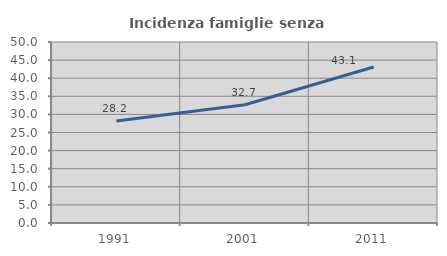
| Category | Incidenza famiglie senza nuclei |
|---|---|
| 1991.0 | 28.205 |
| 2001.0 | 32.673 |
| 2011.0 | 43.082 |